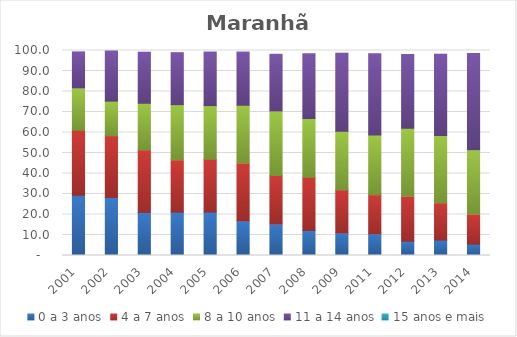
| Category | 0 a 3 anos | 4 a 7 anos | 8 a 10 anos | 11 a 14 anos | 15 anos e mais |
|---|---|---|---|---|---|
| 2001.0 | 29.34 | 31.7 | 20.71 | 17.57 | 0 |
| 2002.0 | 28.33 | 30.13 | 16.83 | 24.43 | 0 |
| 2003.0 | 21.02 | 30.54 | 22.71 | 24.88 | 0 |
| 2004.0 | 21.11 | 25.56 | 26.89 | 25.38 | 0 |
| 2005.0 | 21.16 | 25.76 | 26.19 | 26.11 | 0 |
| 2006.0 | 16.88 | 28.26 | 28.16 | 25.91 | 0 |
| 2007.0 | 15.38 | 23.63 | 31.48 | 27.66 | 0 |
| 2008.0 | 12.2 | 25.96 | 28.65 | 31.64 | 0 |
| 2009.0 | 11.02 | 21.06 | 28.51 | 38.12 | 0 |
| 2011.0 | 10.54 | 19.13 | 29.08 | 39.63 | 0 |
| 2012.0 | 6.99 | 22.07 | 33.06 | 35.88 | 0 |
| 2013.0 | 7.51 | 18.22 | 32.86 | 39.53 | 0 |
| 2014.0 | 5.52 | 14.78 | 31.24 | 47.05 | 0 |